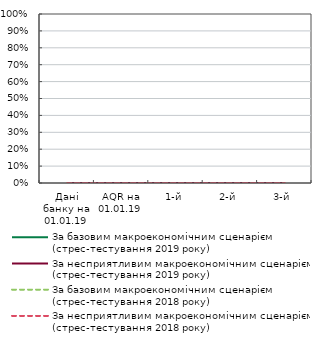
| Category | За базовим макроекономічним сценарієм (стрес-тестування 2019 року) | За несприятливим макроекономічним сценарієм (стрес-тестування 2019 року) | За базовим макроекономічним сценарієм (стрес-тестування 2018 року) | За несприятливим макроекономічним сценарієм (стрес-тестування 2018 року) |
|---|---|---|---|---|
| Дані банку на 01.01.19 | 0 | 0 | 0 | 0 |
| AQR на 01.01.19 | 0 | 0 | 0 | 0 |
| 1-й | 0 | 0 | 0 | 0 |
| 2-й | 0 | 0 | 0 | 0 |
| 3-й | 0 | 0 | 0 | 0 |